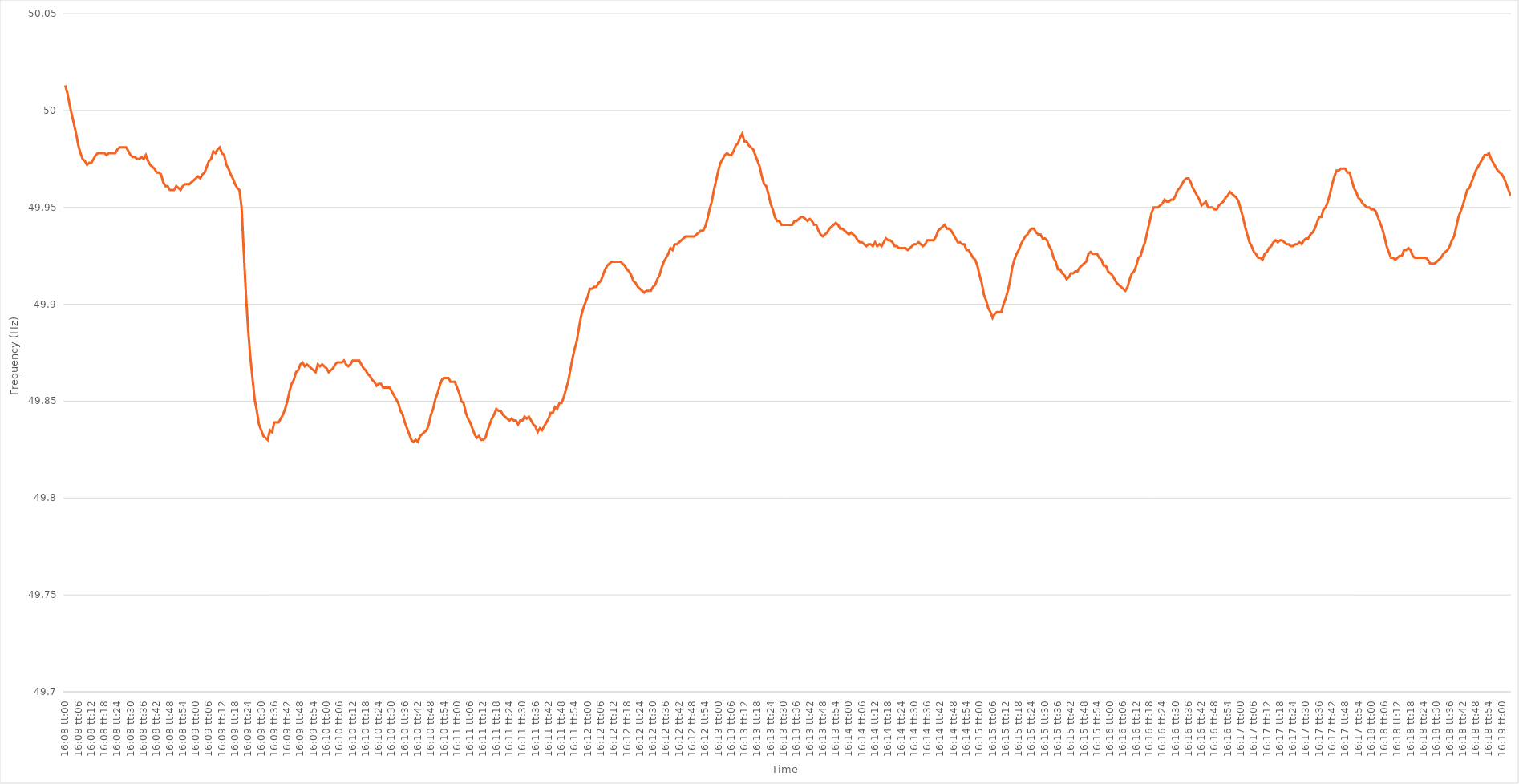
| Category | Series 0 |
|---|---|
| 0.6722222222222222 | 50.013 |
| 0.6722337962962963 | 50.009 |
| 0.6722453703703705 | 50.003 |
| 0.6722569444444444 | 49.998 |
| 0.6722685185185185 | 49.993 |
| 0.6722800925925926 | 49.988 |
| 0.6722916666666667 | 49.982 |
| 0.6723032407407407 | 49.978 |
| 0.6723148148148148 | 49.975 |
| 0.672326388888889 | 49.974 |
| 0.672337962962963 | 49.972 |
| 0.672349537037037 | 49.973 |
| 0.6723611111111111 | 49.973 |
| 0.6723726851851852 | 49.975 |
| 0.6723842592592592 | 49.977 |
| 0.6723958333333333 | 49.978 |
| 0.6724074074074075 | 49.978 |
| 0.6724189814814815 | 49.978 |
| 0.6724305555555555 | 49.978 |
| 0.6724421296296296 | 49.977 |
| 0.6724537037037037 | 49.978 |
| 0.6724652777777779 | 49.978 |
| 0.6724768518518518 | 49.978 |
| 0.672488425925926 | 49.978 |
| 0.6725 | 49.98 |
| 0.6725115740740741 | 49.981 |
| 0.6725231481481481 | 49.981 |
| 0.6725347222222222 | 49.981 |
| 0.6725462962962964 | 49.981 |
| 0.6725578703703704 | 49.979 |
| 0.6725694444444444 | 49.977 |
| 0.6725810185185185 | 49.976 |
| 0.6725925925925926 | 49.976 |
| 0.6726041666666666 | 49.975 |
| 0.6726157407407407 | 49.975 |
| 0.6726273148148149 | 49.976 |
| 0.6726388888888889 | 49.975 |
| 0.6726504629629629 | 49.977 |
| 0.672662037037037 | 49.974 |
| 0.6726736111111111 | 49.972 |
| 0.6726851851851853 | 49.971 |
| 0.6726967592592592 | 49.97 |
| 0.6727083333333334 | 49.968 |
| 0.6727199074074074 | 49.968 |
| 0.6727314814814815 | 49.967 |
| 0.6727430555555555 | 49.963 |
| 0.6727546296296296 | 49.961 |
| 0.6727662037037038 | 49.961 |
| 0.6727777777777778 | 49.959 |
| 0.6727893518518518 | 49.959 |
| 0.6728009259259259 | 49.959 |
| 0.6728125 | 49.961 |
| 0.672824074074074 | 49.96 |
| 0.6728356481481481 | 49.959 |
| 0.6728472222222223 | 49.961 |
| 0.6728587962962963 | 49.962 |
| 0.6728703703703703 | 49.962 |
| 0.6728819444444444 | 49.962 |
| 0.6728935185185185 | 49.963 |
| 0.6729050925925927 | 49.964 |
| 0.6729166666666666 | 49.965 |
| 0.6729282407407408 | 49.966 |
| 0.6729398148148148 | 49.965 |
| 0.672951388888889 | 49.967 |
| 0.6729629629629629 | 49.968 |
| 0.672974537037037 | 49.971 |
| 0.6729861111111112 | 49.974 |
| 0.6729976851851852 | 49.975 |
| 0.6730092592592593 | 49.979 |
| 0.6730208333333333 | 49.978 |
| 0.6730324074074074 | 49.98 |
| 0.6730439814814816 | 49.981 |
| 0.6730555555555555 | 49.978 |
| 0.6730671296296297 | 49.977 |
| 0.6730787037037037 | 49.972 |
| 0.6730902777777777 | 49.97 |
| 0.6731018518518518 | 49.967 |
| 0.6731134259259259 | 49.965 |
| 0.6731250000000001 | 49.962 |
| 0.673136574074074 | 49.96 |
| 0.6731481481481482 | 49.959 |
| 0.6731597222222222 | 49.95 |
| 0.6731712962962964 | 49.927 |
| 0.6731828703703703 | 49.905 |
| 0.6731944444444444 | 49.887 |
| 0.6732060185185186 | 49.873 |
| 0.6732175925925926 | 49.862 |
| 0.6732291666666667 | 49.851 |
| 0.6732407407407407 | 49.845 |
| 0.6732523148148148 | 49.838 |
| 0.673263888888889 | 49.835 |
| 0.6732754629629629 | 49.832 |
| 0.6732870370370371 | 49.831 |
| 0.6732986111111111 | 49.83 |
| 0.6733101851851852 | 49.835 |
| 0.6733217592592592 | 49.834 |
| 0.6733333333333333 | 49.839 |
| 0.6733449074074075 | 49.839 |
| 0.6733564814814814 | 49.839 |
| 0.6733680555555556 | 49.841 |
| 0.6733796296296296 | 49.843 |
| 0.6733912037037038 | 49.846 |
| 0.6734027777777777 | 49.85 |
| 0.6734143518518518 | 49.855 |
| 0.673425925925926 | 49.859 |
| 0.6734375 | 49.861 |
| 0.6734490740740741 | 49.865 |
| 0.6734606481481481 | 49.866 |
| 0.6734722222222222 | 49.869 |
| 0.6734837962962964 | 49.87 |
| 0.6734953703703703 | 49.868 |
| 0.6735069444444445 | 49.869 |
| 0.6735185185185185 | 49.868 |
| 0.6735300925925927 | 49.867 |
| 0.6735416666666666 | 49.866 |
| 0.6735532407407407 | 49.865 |
| 0.6735648148148149 | 49.869 |
| 0.6735763888888888 | 49.868 |
| 0.673587962962963 | 49.869 |
| 0.673599537037037 | 49.868 |
| 0.6736111111111112 | 49.867 |
| 0.6736226851851851 | 49.865 |
| 0.6736342592592592 | 49.866 |
| 0.6736458333333334 | 49.867 |
| 0.6736574074074074 | 49.869 |
| 0.6736689814814815 | 49.87 |
| 0.6736805555555555 | 49.87 |
| 0.6736921296296297 | 49.87 |
| 0.6737037037037038 | 49.871 |
| 0.6737152777777777 | 49.869 |
| 0.6737268518518519 | 49.868 |
| 0.6737384259259259 | 49.869 |
| 0.6737500000000001 | 49.871 |
| 0.673761574074074 | 49.871 |
| 0.6737731481481481 | 49.871 |
| 0.6737847222222223 | 49.871 |
| 0.6737962962962962 | 49.869 |
| 0.6738078703703704 | 49.867 |
| 0.6738194444444444 | 49.866 |
| 0.6738310185185186 | 49.864 |
| 0.6738425925925925 | 49.863 |
| 0.6738541666666666 | 49.861 |
| 0.6738657407407408 | 49.86 |
| 0.6738773148148148 | 49.858 |
| 0.6738888888888889 | 49.859 |
| 0.6739004629629629 | 49.859 |
| 0.6739120370370371 | 49.857 |
| 0.6739236111111112 | 49.857 |
| 0.6739351851851851 | 49.857 |
| 0.6739467592592593 | 49.857 |
| 0.6739583333333333 | 49.855 |
| 0.6739699074074075 | 49.853 |
| 0.6739814814814814 | 49.851 |
| 0.6739930555555556 | 49.849 |
| 0.6740046296296297 | 49.845 |
| 0.6740162037037036 | 49.843 |
| 0.6740277777777778 | 49.839 |
| 0.6740393518518518 | 49.836 |
| 0.674050925925926 | 49.833 |
| 0.6740624999999999 | 49.83 |
| 0.674074074074074 | 49.829 |
| 0.6740856481481482 | 49.83 |
| 0.6740972222222222 | 49.829 |
| 0.6741087962962963 | 49.832 |
| 0.6741203703703703 | 49.833 |
| 0.6741319444444445 | 49.834 |
| 0.6741435185185186 | 49.835 |
| 0.6741550925925925 | 49.838 |
| 0.6741666666666667 | 49.843 |
| 0.6741782407407407 | 49.846 |
| 0.6741898148148149 | 49.851 |
| 0.6742013888888888 | 49.854 |
| 0.674212962962963 | 49.858 |
| 0.6742245370370371 | 49.861 |
| 0.6742361111111111 | 49.862 |
| 0.6742476851851852 | 49.862 |
| 0.6742592592592592 | 49.862 |
| 0.6742708333333334 | 49.86 |
| 0.6742824074074073 | 49.86 |
| 0.6742939814814815 | 49.86 |
| 0.6743055555555556 | 49.857 |
| 0.6743171296296296 | 49.854 |
| 0.6743287037037037 | 49.85 |
| 0.6743402777777777 | 49.849 |
| 0.6743518518518519 | 49.844 |
| 0.674363425925926 | 49.841 |
| 0.674375 | 49.839 |
| 0.6743865740740741 | 49.836 |
| 0.6743981481481481 | 49.833 |
| 0.6744097222222223 | 49.831 |
| 0.6744212962962962 | 49.832 |
| 0.6744328703703704 | 49.83 |
| 0.6744444444444445 | 49.83 |
| 0.6744560185185186 | 49.831 |
| 0.6744675925925926 | 49.835 |
| 0.6744791666666666 | 49.838 |
| 0.6744907407407408 | 49.841 |
| 0.6745023148148147 | 49.843 |
| 0.6745138888888889 | 49.846 |
| 0.674525462962963 | 49.845 |
| 0.674537037037037 | 49.845 |
| 0.6745486111111111 | 49.843 |
| 0.6745601851851851 | 49.842 |
| 0.6745717592592593 | 49.841 |
| 0.6745833333333334 | 49.84 |
| 0.6745949074074074 | 49.841 |
| 0.6746064814814815 | 49.84 |
| 0.6746180555555555 | 49.84 |
| 0.6746296296296297 | 49.838 |
| 0.6746412037037036 | 49.84 |
| 0.6746527777777778 | 49.84 |
| 0.6746643518518519 | 49.842 |
| 0.674675925925926 | 49.841 |
| 0.6746875 | 49.842 |
| 0.674699074074074 | 49.84 |
| 0.6747106481481482 | 49.838 |
| 0.6747222222222221 | 49.837 |
| 0.6747337962962963 | 49.834 |
| 0.6747453703703704 | 49.836 |
| 0.6747569444444445 | 49.835 |
| 0.6747685185185185 | 49.837 |
| 0.6747800925925925 | 49.839 |
| 0.6747916666666667 | 49.841 |
| 0.6748032407407408 | 49.844 |
| 0.6748148148148148 | 49.844 |
| 0.6748263888888889 | 49.847 |
| 0.674837962962963 | 49.846 |
| 0.6748495370370371 | 49.849 |
| 0.674861111111111 | 49.849 |
| 0.6748726851851852 | 49.852 |
| 0.6748842592592593 | 49.856 |
| 0.6748958333333334 | 49.86 |
| 0.6749074074074074 | 49.866 |
| 0.6749189814814814 | 49.872 |
| 0.6749305555555556 | 49.877 |
| 0.6749421296296297 | 49.881 |
| 0.6749537037037037 | 49.888 |
| 0.6749652777777778 | 49.894 |
| 0.6749768518518519 | 49.898 |
| 0.6749884259259259 | 49.901 |
| 0.6749999999999999 | 49.904 |
| 0.6750115740740741 | 49.908 |
| 0.6750231481481482 | 49.908 |
| 0.6750347222222222 | 49.909 |
| 0.6750462962962963 | 49.909 |
| 0.6750578703703703 | 49.911 |
| 0.6750694444444445 | 49.912 |
| 0.6750810185185184 | 49.915 |
| 0.6750925925925926 | 49.918 |
| 0.6751041666666667 | 49.92 |
| 0.6751157407407408 | 49.921 |
| 0.6751273148148148 | 49.922 |
| 0.6751388888888888 | 49.922 |
| 0.675150462962963 | 49.922 |
| 0.6751620370370371 | 49.922 |
| 0.6751736111111111 | 49.922 |
| 0.6751851851851852 | 49.921 |
| 0.6751967592592593 | 49.92 |
| 0.6752083333333333 | 49.918 |
| 0.6752199074074073 | 49.917 |
| 0.6752314814814815 | 49.915 |
| 0.6752430555555556 | 49.912 |
| 0.6752546296296296 | 49.911 |
| 0.6752662037037037 | 49.909 |
| 0.6752777777777778 | 49.908 |
| 0.6752893518518519 | 49.907 |
| 0.6753009259259258 | 49.906 |
| 0.6753125 | 49.907 |
| 0.6753240740740741 | 49.907 |
| 0.6753356481481482 | 49.907 |
| 0.6753472222222222 | 49.909 |
| 0.6753587962962962 | 49.91 |
| 0.6753703703703704 | 49.913 |
| 0.6753819444444445 | 49.915 |
| 0.6753935185185185 | 49.919 |
| 0.6754050925925926 | 49.922 |
| 0.6754166666666667 | 49.924 |
| 0.6754282407407407 | 49.926 |
| 0.6754398148148147 | 49.929 |
| 0.6754513888888889 | 49.928 |
| 0.675462962962963 | 49.931 |
| 0.675474537037037 | 49.931 |
| 0.6754861111111111 | 49.932 |
| 0.6754976851851852 | 49.933 |
| 0.6755092592592593 | 49.934 |
| 0.6755208333333332 | 49.935 |
| 0.6755324074074074 | 49.935 |
| 0.6755439814814815 | 49.935 |
| 0.6755555555555556 | 49.935 |
| 0.6755671296296296 | 49.935 |
| 0.6755787037037037 | 49.936 |
| 0.6755902777777778 | 49.937 |
| 0.675601851851852 | 49.938 |
| 0.6756134259259259 | 49.938 |
| 0.675625 | 49.94 |
| 0.6756365740740741 | 49.944 |
| 0.6756481481481482 | 49.949 |
| 0.6756597222222221 | 49.953 |
| 0.6756712962962963 | 49.959 |
| 0.6756828703703704 | 49.964 |
| 0.6756944444444444 | 49.969 |
| 0.6757060185185185 | 49.973 |
| 0.6757175925925926 | 49.975 |
| 0.6757291666666667 | 49.977 |
| 0.6757407407407406 | 49.978 |
| 0.6757523148148148 | 49.977 |
| 0.6757638888888889 | 49.977 |
| 0.675775462962963 | 49.979 |
| 0.675787037037037 | 49.982 |
| 0.6757986111111111 | 49.983 |
| 0.6758101851851852 | 49.986 |
| 0.6758217592592594 | 49.988 |
| 0.6758333333333333 | 49.984 |
| 0.6758449074074074 | 49.984 |
| 0.6758564814814815 | 49.982 |
| 0.6758680555555556 | 49.981 |
| 0.6758796296296296 | 49.98 |
| 0.6758912037037037 | 49.977 |
| 0.6759027777777779 | 49.974 |
| 0.6759143518518518 | 49.971 |
| 0.6759259259259259 | 49.966 |
| 0.6759375 | 49.962 |
| 0.6759490740740741 | 49.961 |
| 0.675960648148148 | 49.957 |
| 0.6759722222222222 | 49.952 |
| 0.6759837962962963 | 49.949 |
| 0.6759953703703704 | 49.945 |
| 0.6760069444444444 | 49.943 |
| 0.6760185185185185 | 49.943 |
| 0.6760300925925926 | 49.941 |
| 0.6760416666666668 | 49.941 |
| 0.6760532407407407 | 49.941 |
| 0.6760648148148148 | 49.941 |
| 0.6760763888888889 | 49.941 |
| 0.676087962962963 | 49.941 |
| 0.676099537037037 | 49.943 |
| 0.6761111111111111 | 49.943 |
| 0.6761226851851853 | 49.944 |
| 0.6761342592592593 | 49.945 |
| 0.6761458333333333 | 49.945 |
| 0.6761574074074074 | 49.944 |
| 0.6761689814814815 | 49.943 |
| 0.6761805555555555 | 49.944 |
| 0.6761921296296296 | 49.943 |
| 0.6762037037037038 | 49.941 |
| 0.6762152777777778 | 49.941 |
| 0.6762268518518518 | 49.938 |
| 0.6762384259259259 | 49.936 |
| 0.67625 | 49.935 |
| 0.6762615740740742 | 49.936 |
| 0.6762731481481481 | 49.937 |
| 0.6762847222222222 | 49.939 |
| 0.6762962962962963 | 49.94 |
| 0.6763078703703704 | 49.941 |
| 0.6763194444444444 | 49.942 |
| 0.6763310185185185 | 49.941 |
| 0.6763425925925927 | 49.939 |
| 0.6763541666666667 | 49.939 |
| 0.6763657407407407 | 49.938 |
| 0.6763773148148148 | 49.937 |
| 0.6763888888888889 | 49.936 |
| 0.6764004629629629 | 49.937 |
| 0.676412037037037 | 49.936 |
| 0.6764236111111112 | 49.935 |
| 0.6764351851851852 | 49.933 |
| 0.6764467592592592 | 49.932 |
| 0.6764583333333333 | 49.932 |
| 0.6764699074074074 | 49.931 |
| 0.6764814814814816 | 49.93 |
| 0.6764930555555555 | 49.931 |
| 0.6765046296296297 | 49.931 |
| 0.6765162037037037 | 49.93 |
| 0.6765277777777778 | 49.932 |
| 0.6765393518518518 | 49.93 |
| 0.6765509259259259 | 49.931 |
| 0.6765625000000001 | 49.93 |
| 0.6765740740740741 | 49.932 |
| 0.6765856481481481 | 49.934 |
| 0.6765972222222222 | 49.933 |
| 0.6766087962962963 | 49.933 |
| 0.6766203703703703 | 49.932 |
| 0.6766319444444444 | 49.93 |
| 0.6766435185185186 | 49.93 |
| 0.6766550925925926 | 49.929 |
| 0.6766666666666666 | 49.929 |
| 0.6766782407407407 | 49.929 |
| 0.6766898148148148 | 49.929 |
| 0.676701388888889 | 49.928 |
| 0.6767129629629629 | 49.929 |
| 0.676724537037037 | 49.93 |
| 0.6767361111111111 | 49.931 |
| 0.6767476851851852 | 49.931 |
| 0.6767592592592592 | 49.932 |
| 0.6767708333333333 | 49.931 |
| 0.6767824074074075 | 49.93 |
| 0.6767939814814815 | 49.931 |
| 0.6768055555555555 | 49.933 |
| 0.6768171296296296 | 49.933 |
| 0.6768287037037037 | 49.933 |
| 0.6768402777777779 | 49.933 |
| 0.6768518518518518 | 49.935 |
| 0.676863425925926 | 49.938 |
| 0.676875 | 49.939 |
| 0.676886574074074 | 49.94 |
| 0.6768981481481481 | 49.941 |
| 0.6769097222222222 | 49.939 |
| 0.6769212962962964 | 49.939 |
| 0.6769328703703703 | 49.938 |
| 0.6769444444444445 | 49.936 |
| 0.6769560185185185 | 49.934 |
| 0.6769675925925926 | 49.932 |
| 0.6769791666666666 | 49.932 |
| 0.6769907407407407 | 49.931 |
| 0.6770023148148149 | 49.931 |
| 0.6770138888888889 | 49.928 |
| 0.677025462962963 | 49.928 |
| 0.677037037037037 | 49.926 |
| 0.6770486111111111 | 49.924 |
| 0.6770601851851853 | 49.923 |
| 0.6770717592592592 | 49.92 |
| 0.6770833333333334 | 49.915 |
| 0.6770949074074074 | 49.911 |
| 0.6771064814814814 | 49.905 |
| 0.6771180555555555 | 49.902 |
| 0.6771296296296296 | 49.898 |
| 0.6771412037037038 | 49.896 |
| 0.6771527777777777 | 49.893 |
| 0.6771643518518519 | 49.895 |
| 0.6771759259259259 | 49.896 |
| 0.6771875 | 49.896 |
| 0.677199074074074 | 49.896 |
| 0.6772106481481481 | 49.9 |
| 0.6772222222222223 | 49.903 |
| 0.6772337962962963 | 49.907 |
| 0.6772453703703704 | 49.912 |
| 0.6772569444444444 | 49.919 |
| 0.6772685185185185 | 49.923 |
| 0.6772800925925927 | 49.926 |
| 0.6772916666666666 | 49.928 |
| 0.6773032407407408 | 49.931 |
| 0.6773148148148148 | 49.933 |
| 0.6773263888888889 | 49.935 |
| 0.6773379629629629 | 49.936 |
| 0.677349537037037 | 49.938 |
| 0.6773611111111112 | 49.939 |
| 0.6773726851851851 | 49.939 |
| 0.6773842592592593 | 49.937 |
| 0.6773958333333333 | 49.936 |
| 0.6774074074074075 | 49.936 |
| 0.6774189814814814 | 49.934 |
| 0.6774305555555555 | 49.934 |
| 0.6774421296296297 | 49.933 |
| 0.6774537037037037 | 49.93 |
| 0.6774652777777778 | 49.928 |
| 0.6774768518518518 | 49.924 |
| 0.677488425925926 | 49.922 |
| 0.6775000000000001 | 49.918 |
| 0.677511574074074 | 49.918 |
| 0.6775231481481482 | 49.916 |
| 0.6775347222222222 | 49.915 |
| 0.6775462962962964 | 49.913 |
| 0.6775578703703703 | 49.914 |
| 0.6775694444444444 | 49.916 |
| 0.6775810185185186 | 49.916 |
| 0.6775925925925925 | 49.917 |
| 0.6776041666666667 | 49.917 |
| 0.6776157407407407 | 49.919 |
| 0.6776273148148149 | 49.92 |
| 0.6776388888888888 | 49.921 |
| 0.6776504629629629 | 49.922 |
| 0.6776620370370371 | 49.926 |
| 0.6776736111111111 | 49.927 |
| 0.6776851851851852 | 49.926 |
| 0.6776967592592592 | 49.926 |
| 0.6777083333333334 | 49.926 |
| 0.6777199074074075 | 49.924 |
| 0.6777314814814814 | 49.923 |
| 0.6777430555555556 | 49.92 |
| 0.6777546296296296 | 49.92 |
| 0.6777662037037038 | 49.917 |
| 0.6777777777777777 | 49.916 |
| 0.6777893518518519 | 49.915 |
| 0.677800925925926 | 49.913 |
| 0.6778124999999999 | 49.911 |
| 0.6778240740740741 | 49.91 |
| 0.6778356481481481 | 49.909 |
| 0.6778472222222223 | 49.908 |
| 0.6778587962962962 | 49.907 |
| 0.6778703703703703 | 49.909 |
| 0.6778819444444445 | 49.913 |
| 0.6778935185185185 | 49.916 |
| 0.6779050925925926 | 49.917 |
| 0.6779166666666666 | 49.92 |
| 0.6779282407407408 | 49.924 |
| 0.6779398148148149 | 49.925 |
| 0.6779513888888888 | 49.929 |
| 0.677962962962963 | 49.932 |
| 0.677974537037037 | 49.937 |
| 0.6779861111111112 | 49.942 |
| 0.6779976851851851 | 49.947 |
| 0.6780092592592593 | 49.95 |
| 0.6780208333333334 | 49.95 |
| 0.6780324074074073 | 49.95 |
| 0.6780439814814815 | 49.951 |
| 0.6780555555555555 | 49.952 |
| 0.6780671296296297 | 49.954 |
| 0.6780787037037036 | 49.953 |
| 0.6780902777777778 | 49.953 |
| 0.6781018518518519 | 49.954 |
| 0.6781134259259259 | 49.954 |
| 0.678125 | 49.956 |
| 0.678136574074074 | 49.959 |
| 0.6781481481481482 | 49.96 |
| 0.6781597222222223 | 49.962 |
| 0.6781712962962962 | 49.964 |
| 0.6781828703703704 | 49.965 |
| 0.6781944444444444 | 49.965 |
| 0.6782060185185186 | 49.963 |
| 0.6782175925925925 | 49.96 |
| 0.6782291666666667 | 49.958 |
| 0.6782407407407408 | 49.956 |
| 0.6782523148148148 | 49.954 |
| 0.6782638888888889 | 49.951 |
| 0.6782754629629629 | 49.952 |
| 0.6782870370370371 | 49.953 |
| 0.678298611111111 | 49.95 |
| 0.6783101851851852 | 49.95 |
| 0.6783217592592593 | 49.95 |
| 0.6783333333333333 | 49.949 |
| 0.6783449074074074 | 49.949 |
| 0.6783564814814814 | 49.951 |
| 0.6783680555555556 | 49.952 |
| 0.6783796296296297 | 49.953 |
| 0.6783912037037036 | 49.955 |
| 0.6784027777777778 | 49.956 |
| 0.6784143518518518 | 49.958 |
| 0.678425925925926 | 49.957 |
| 0.6784374999999999 | 49.956 |
| 0.6784490740740741 | 49.955 |
| 0.6784606481481482 | 49.953 |
| 0.6784722222222223 | 49.949 |
| 0.6784837962962963 | 49.945 |
| 0.6784953703703703 | 49.94 |
| 0.6785069444444445 | 49.936 |
| 0.6785185185185184 | 49.932 |
| 0.6785300925925926 | 49.93 |
| 0.6785416666666667 | 49.927 |
| 0.6785532407407407 | 49.926 |
| 0.6785648148148148 | 49.924 |
| 0.6785763888888888 | 49.924 |
| 0.678587962962963 | 49.923 |
| 0.6785995370370371 | 49.926 |
| 0.678611111111111 | 49.927 |
| 0.6786226851851852 | 49.929 |
| 0.6786342592592592 | 49.93 |
| 0.6786458333333334 | 49.932 |
| 0.6786574074074073 | 49.933 |
| 0.6786689814814815 | 49.932 |
| 0.6786805555555556 | 49.933 |
| 0.6786921296296297 | 49.933 |
| 0.6787037037037037 | 49.932 |
| 0.6787152777777777 | 49.931 |
| 0.6787268518518519 | 49.931 |
| 0.678738425925926 | 49.93 |
| 0.67875 | 49.93 |
| 0.6787615740740741 | 49.931 |
| 0.6787731481481482 | 49.931 |
| 0.6787847222222222 | 49.932 |
| 0.6787962962962962 | 49.931 |
| 0.6788078703703704 | 49.933 |
| 0.6788194444444445 | 49.934 |
| 0.6788310185185185 | 49.934 |
| 0.6788425925925926 | 49.936 |
| 0.6788541666666666 | 49.937 |
| 0.6788657407407408 | 49.939 |
| 0.6788773148148147 | 49.942 |
| 0.6788888888888889 | 49.945 |
| 0.678900462962963 | 49.945 |
| 0.6789120370370371 | 49.949 |
| 0.6789236111111111 | 49.95 |
| 0.6789351851851851 | 49.953 |
| 0.6789467592592593 | 49.957 |
| 0.6789583333333334 | 49.962 |
| 0.6789699074074074 | 49.966 |
| 0.6789814814814815 | 49.969 |
| 0.6789930555555556 | 49.969 |
| 0.6790046296296296 | 49.97 |
| 0.6790162037037036 | 49.97 |
| 0.6790277777777778 | 49.97 |
| 0.6790393518518519 | 49.968 |
| 0.6790509259259259 | 49.968 |
| 0.6790625 | 49.964 |
| 0.679074074074074 | 49.96 |
| 0.6790856481481482 | 49.958 |
| 0.6790972222222221 | 49.955 |
| 0.6791087962962963 | 49.954 |
| 0.6791203703703704 | 49.952 |
| 0.6791319444444445 | 49.951 |
| 0.6791435185185185 | 49.95 |
| 0.6791550925925925 | 49.95 |
| 0.6791666666666667 | 49.949 |
| 0.6791782407407408 | 49.949 |
| 0.6791898148148148 | 49.948 |
| 0.6792013888888889 | 49.945 |
| 0.679212962962963 | 49.942 |
| 0.679224537037037 | 49.939 |
| 0.679236111111111 | 49.935 |
| 0.6792476851851852 | 49.93 |
| 0.6792592592592593 | 49.927 |
| 0.6792708333333333 | 49.924 |
| 0.6792824074074074 | 49.924 |
| 0.6792939814814815 | 49.923 |
| 0.6793055555555556 | 49.924 |
| 0.6793171296296295 | 49.925 |
| 0.6793287037037037 | 49.925 |
| 0.6793402777777778 | 49.928 |
| 0.6793518518518519 | 49.928 |
| 0.6793634259259259 | 49.929 |
| 0.679375 | 49.928 |
| 0.6793865740740741 | 49.925 |
| 0.6793981481481483 | 49.924 |
| 0.6794097222222222 | 49.924 |
| 0.6794212962962963 | 49.924 |
| 0.6794328703703704 | 49.924 |
| 0.6794444444444444 | 49.924 |
| 0.6794560185185184 | 49.924 |
| 0.6794675925925926 | 49.923 |
| 0.6794791666666667 | 49.921 |
| 0.6794907407407407 | 49.921 |
| 0.6795023148148148 | 49.921 |
| 0.6795138888888889 | 49.922 |
| 0.679525462962963 | 49.923 |
| 0.6795370370370369 | 49.924 |
| 0.6795486111111111 | 49.926 |
| 0.6795601851851852 | 49.927 |
| 0.6795717592592593 | 49.928 |
| 0.6795833333333333 | 49.93 |
| 0.6795949074074074 | 49.933 |
| 0.6796064814814815 | 49.935 |
| 0.6796180555555557 | 49.94 |
| 0.6796296296296296 | 49.945 |
| 0.6796412037037037 | 49.948 |
| 0.6796527777777778 | 49.951 |
| 0.6796643518518519 | 49.955 |
| 0.6796759259259259 | 49.959 |
| 0.6796875 | 49.96 |
| 0.6796990740740741 | 49.963 |
| 0.6797106481481481 | 49.966 |
| 0.6797222222222222 | 49.969 |
| 0.6797337962962963 | 49.971 |
| 0.6797453703703704 | 49.973 |
| 0.6797569444444443 | 49.975 |
| 0.6797685185185185 | 49.977 |
| 0.6797800925925926 | 49.977 |
| 0.6797916666666667 | 49.978 |
| 0.6798032407407407 | 49.975 |
| 0.6798148148148148 | 49.973 |
| 0.6798263888888889 | 49.971 |
| 0.6798379629629631 | 49.969 |
| 0.679849537037037 | 49.968 |
| 0.6798611111111111 | 49.967 |
| 0.6798726851851852 | 49.965 |
| 0.6798842592592593 | 49.962 |
| 0.6798958333333333 | 49.959 |
| 0.6799074074074074 | 49.956 |